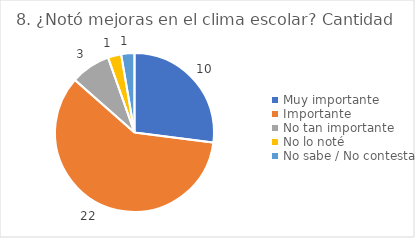
| Category | 8. ¿Notó mejoras en el clima escolar? |
|---|---|
| Muy importante  | 0.27 |
| Importante  | 0.595 |
| No tan importante  | 0.081 |
| No lo noté  | 0.027 |
| No sabe / No contesta | 0.027 |